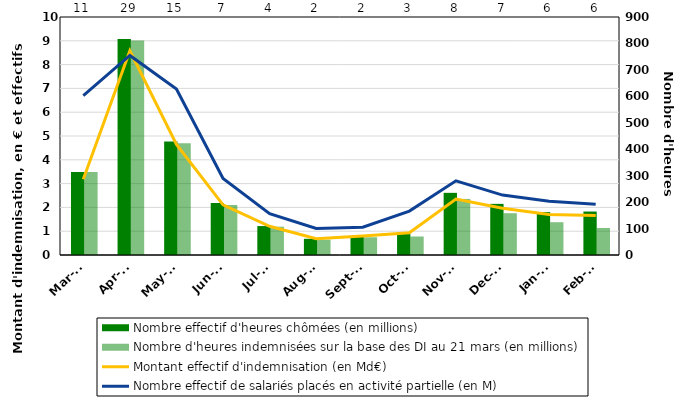
| Category | Nombre effectif d'heures chômées (en millions) | Nombre d'heures indemnisées sur la base des DI au 21 mars (en millions) |
|---|---|---|
| 2020-03-01 | 313.671 | 314 |
| 2020-04-01 | 817.081 | 811 |
| 2020-05-01 | 429.63 | 423 |
| 2020-06-01 | 196.582 | 189 |
| 2020-07-01 | 109.418 | 107 |
| 2020-08-01 | 61.265 | 58 |
| 2020-09-01 | 69.454 | 67 |
| 2020-10-01 | 83.757 | 70 |
| 2020-11-01 | 235.056 | 212 |
| 2020-12-01 | 193.38 | 158 |
| 2021-01-01 | 162.244 | 124 |
| 2021-02-01 | 164.399 | 102 |